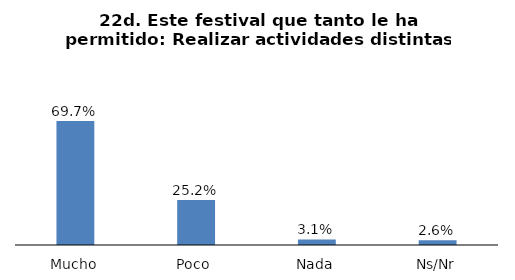
| Category | Series 0 |
|---|---|
| Mucho | 0.697 |
| Poco  | 0.252 |
| Nada | 0.031 |
| Ns/Nr | 0.026 |